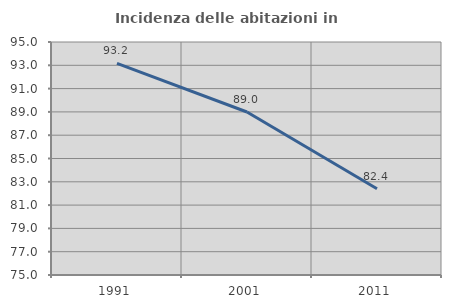
| Category | Incidenza delle abitazioni in proprietà  |
|---|---|
| 1991.0 | 93.162 |
| 2001.0 | 88.991 |
| 2011.0 | 82.407 |